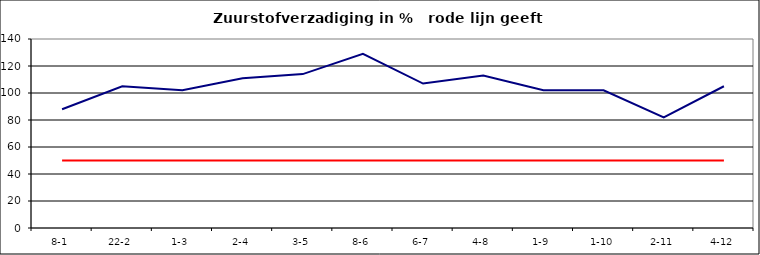
| Category | Series 0 | Series 1 |
|---|---|---|
| 8-1 | 88 | 50 |
| 22-2 | 105 | 50 |
| 1-3 | 102 | 50 |
| 2-4 | 111 | 50 |
| 3-5 | 114 | 50 |
| 8-6 | 129 | 50 |
| 6-7 | 107 | 50 |
| 4-8 | 113 | 50 |
| 1-9 | 102 | 50 |
| 1-10 | 102 | 50 |
| 2-11 | 82 | 50 |
| 4-12 | 105 | 50 |